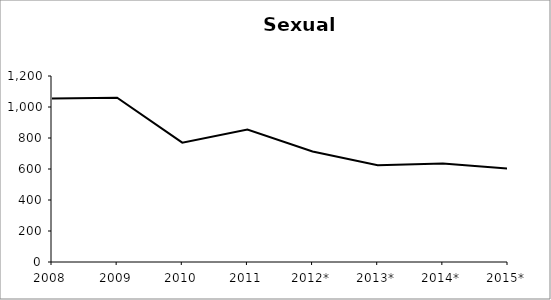
| Category | Series 0 |
|---|---|
| 2008 | 1055 |
| 2009 | 1060 |
| 2010 | 770 |
| 2011 | 854 |
| 2012* | 713 |
| 2013* | 625 |
| 2014* | 635 |
| 2015* | 602 |